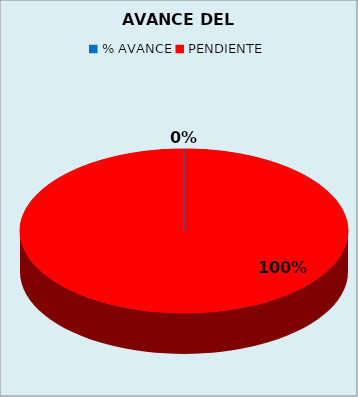
| Category | AVANCE DEL PROYECTO |
|---|---|
| % AVANCE | 0 |
| PENDIENTE | 1 |